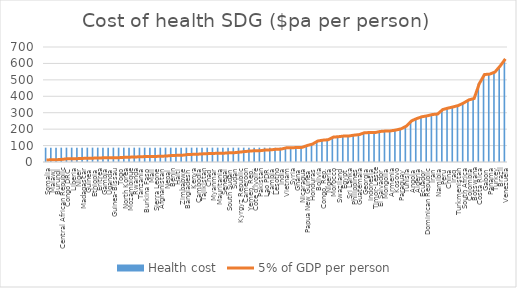
| Category | Health cost |
|---|---|
| Somalia | 87.29 |
| Malawi | 87.29 |
| Burundi | 87.29 |
| Central African Republic | 87.29 |
| Congo DRC | 87.29 |
| Liberia | 87.29 |
| Niger | 87.29 |
| Madagascar | 87.29 |
| Guinea | 87.29 |
| Ethiopia | 87.29 |
| Eritrea | 87.29 |
| Gambia | 87.29 |
| Uganda | 87.29 |
| Guinea-Bissau | 87.29 |
| Togo | 87.29 |
| North Korea | 87.29 |
| Mozambique | 87.29 |
| Rwanda | 87.29 |
| Tanzania | 87.29 |
| Burkina Faso | 87.29 |
| Mali | 87.29 |
| Sierra Leone | 87.29 |
| Afghanistan | 87.29 |
| Nepal | 87.29 |
| Benin | 87.29 |
| Haiti | 87.29 |
| Zimbabwe | 87.29 |
| Bangladesh | 87.29 |
| Kenya | 87.29 |
| Cambodia | 87.29 |
| Tajikistan | 87.29 |
| Chad | 87.29 |
| Myanmar | 87.29 |
| Mauritania | 87.29 |
| Senegal | 87.29 |
| South Sudan | 87.29 |
| Sudan | 87.29 |
| Kyrgyz Republic | 87.29 |
| Cameroon | 87.29 |
| Yemen, Rep. | 87.29 |
| Côte d'Ivoire | 87.29 |
| Pakistan | 87.29 |
| Lao PDR | 87.29 |
| Zambia | 87.29 |
| Lesotho | 87.29 |
| India | 87.29 |
| Vietnam | 87.29 |
| Syria | 87.29 |
| Ghana | 88 |
| Nicaragua | 89 |
| Papua New Guinea | 100.5 |
| Honduras | 109 |
| Bolivia | 127.5 |
| Congo, Rep. | 133 |
| Nigeria | 135.5 |
| Morocco | 151.5 |
| Swaziland | 154 |
| Egypt | 158 |
| Sri Lanka | 158.5 |
| Philippines | 163.5 |
| Guatemala | 167 |
| Georgia | 178.5 |
| Indonesia | 179 |
| Timor-Leste | 179 |
| El Salvador | 186 |
| Mongolia | 188.5 |
| Armenia | 189.5 |
| Kosovo | 194.5 |
| Paraguay | 202 |
| Tunisia | 218 |
| Angola | 250.5 |
| Algeria | 264.5 |
| Ecuador | 275.5 |
| Dominican Republic | 281 |
| Iran | 289 |
| Namibia | 292 |
| Peru | 319.5 |
| China | 328 |
| Iraq | 335.5 |
| Turkmenistan | 344 |
| South Africa | 359.5 |
| Colombia | 378 |
| Botswana | 386.5 |
| Costa Rica | 477.5 |
| Gabon | 532.5 |
| Panama | 535 |
| Turkey | 547.5 |
| Brazil | 584.5 |
| Venezuela | 627.5 |